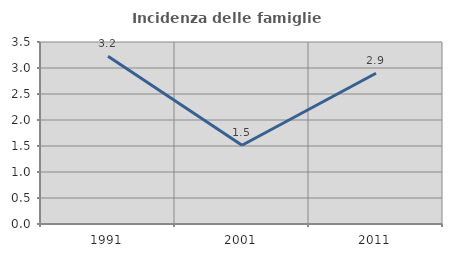
| Category | Incidenza delle famiglie numerose |
|---|---|
| 1991.0 | 3.226 |
| 2001.0 | 1.515 |
| 2011.0 | 2.899 |